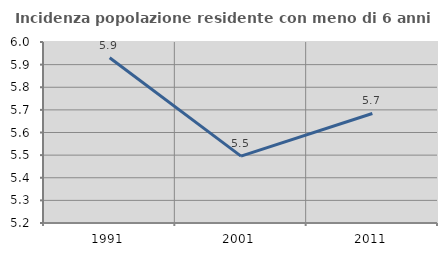
| Category | Incidenza popolazione residente con meno di 6 anni |
|---|---|
| 1991.0 | 5.93 |
| 2001.0 | 5.496 |
| 2011.0 | 5.684 |